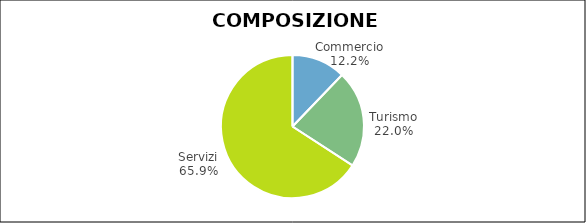
| Category | Series 0 |
|---|---|
| Commercio | 11070 |
| Turismo | 20000 |
| Servizi | 59880 |